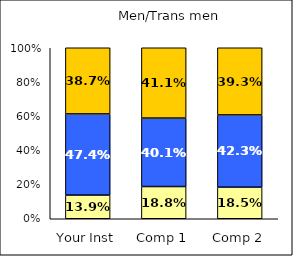
| Category | Low Institutional Priority: Commitment to Diversity | Average Institutional Priority: Commitment to Diversity | High Institutional Priority: Commitment to Diversity |
|---|---|---|---|
| Your Inst | 0.139 | 0.474 | 0.387 |
| Comp 1 | 0.188 | 0.401 | 0.411 |
| Comp 2 | 0.185 | 0.423 | 0.393 |